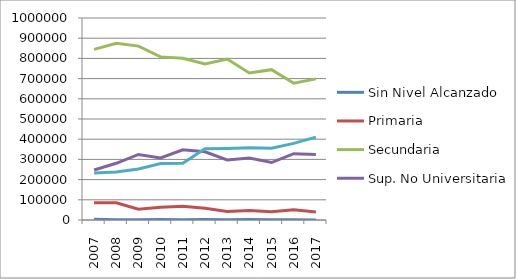
| Category | Sin Nivel Alcanzado | Primaria | Secundaria | Sup. No Universitaria | Sup. Universitaria |
|---|---|---|---|---|---|
| 2007.0 | 3341 | 85550 | 844637 | 247667 | 232321 |
| 2008.0 | 991 | 85125 | 875104 | 280798 | 237789 |
| 2009.0 | 1111 | 53228 | 860815 | 324368 | 252129 |
| 2010.0 | 2070 | 63651 | 807538 | 306903 | 279407 |
| 2011.0 | 1747 | 68295 | 801034 | 347263 | 280487 |
| 2012.0 | 2141 | 57729 | 772859 | 337866 | 353220 |
| 2013.0 | 1009 | 41847 | 796796 | 297005 | 354383 |
| 2014.0 | 2958 | 46809 | 728105 | 306297 | 357410 |
| 2015.0 | 1849 | 40344 | 744259 | 284521 | 354782 |
| 2016.0 | 811 | 50269 | 677363 | 328302 | 379287 |
| 2017.0 | 295 | 40116 | 698607 | 324020 | 410195 |